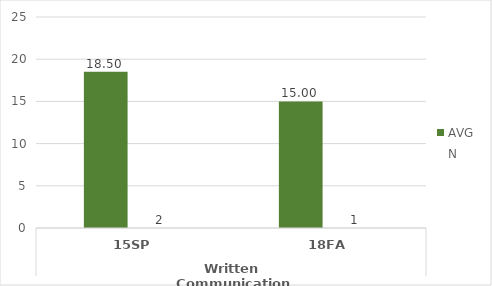
| Category | ENGL.AA - AVG | ENGL.AA - N |
|---|---|---|
| 0 | 18.5 | 2 |
| 1 | 15 | 1 |